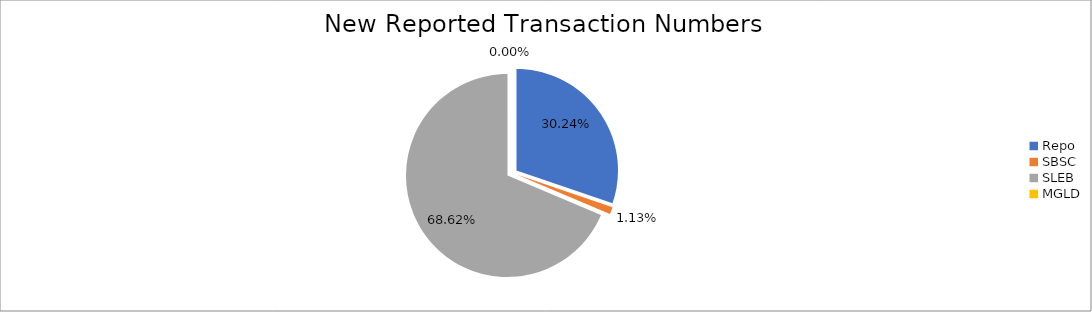
| Category | Series 0 |
|---|---|
| Repo | 277768 |
| SBSC | 10364 |
| SLEB | 630294 |
| MGLD | 43 |